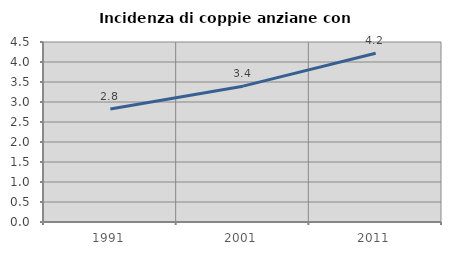
| Category | Incidenza di coppie anziane con figli |
|---|---|
| 1991.0 | 2.827 |
| 2001.0 | 3.396 |
| 2011.0 | 4.219 |